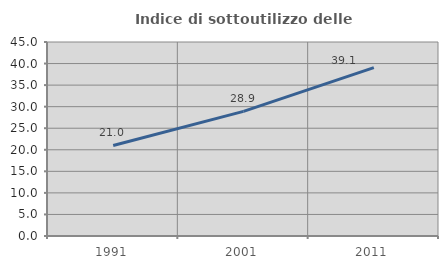
| Category | Indice di sottoutilizzo delle abitazioni  |
|---|---|
| 1991.0 | 21 |
| 2001.0 | 28.904 |
| 2011.0 | 39.058 |